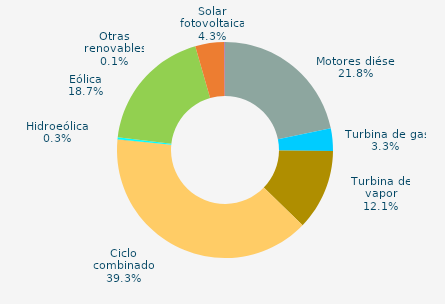
| Category | Series 0 |
|---|---|
| Motores diésel | 21.784 |
| Turbina de gas | 3.349 |
| Turbina de vapor | 12.112 |
| Ciclo combinado | 39.291 |
| Cogeneración | 0 |
| Hidráulica | 0.043 |
| Hidroeólica | 0.295 |
| Eólica | 18.686 |
| Solar fotovoltaica | 4.347 |
| Otras renovables | 0.093 |